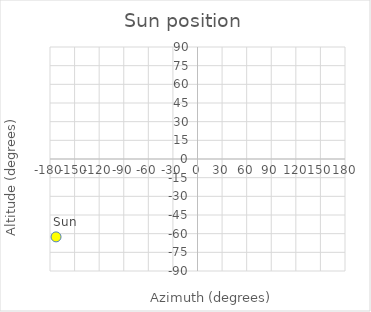
| Category | Sun |
|---|---|
| -172.6228560666281 | -62.586 |